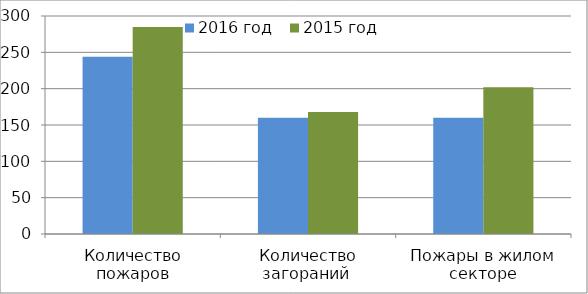
| Category | 2016 год | 2015 год |
|---|---|---|
| Количество пожаров | 244 | 285 |
| Количество загораний  | 160 | 168 |
| Пожары в жилом секторе | 160 | 202 |